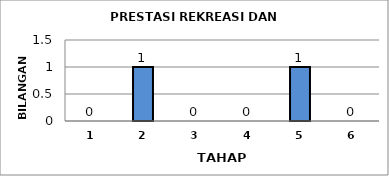
| Category | Series 0 |
|---|---|
| 1.0 | 0 |
| 2.0 | 1 |
| 3.0 | 0 |
| 4.0 | 0 |
| 5.0 | 1 |
| 6.0 | 0 |